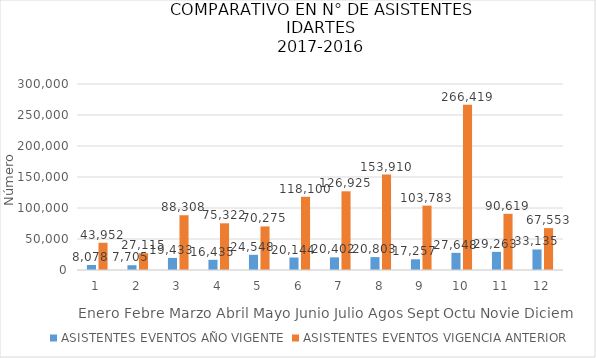
| Category | ASISTENTES EVENTOS AÑO VIGENTE | ASISTENTES EVENTOS VIGENCIA ANTERIOR |
|---|---|---|
| 0 | 8078 | 43952 |
| 1 | 7705 | 27115 |
| 2 | 19433 | 88308 |
| 3 | 16435 | 75322 |
| 4 | 24548 | 70275 |
| 5 | 20144 | 118100 |
| 6 | 20402 | 126925 |
| 7 | 20803 | 153910 |
| 8 | 17257 | 103783 |
| 9 | 27648 | 266419 |
| 10 | 29263 | 90619 |
| 11 | 33135 | 67553 |